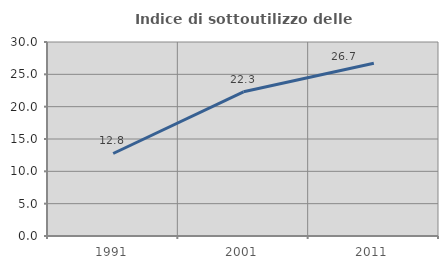
| Category | Indice di sottoutilizzo delle abitazioni  |
|---|---|
| 1991.0 | 12.76 |
| 2001.0 | 22.303 |
| 2011.0 | 26.721 |